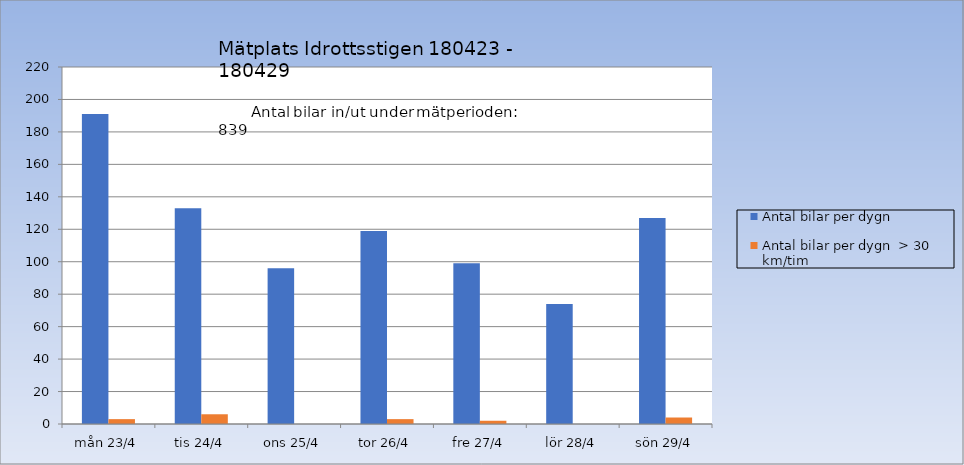
| Category | Antal bilar per dygn | Antal bilar per dygn  > 30 km/tim |
|---|---|---|
| mån 23/4 | 191 | 3 |
| tis 24/4 | 133 | 6 |
| ons 25/4 | 96 | 0 |
| tor 26/4 | 119 | 3 |
| fre 27/4 | 99 | 2 |
| lör 28/4 | 74 | 0 |
| sön 29/4 | 127 | 4 |